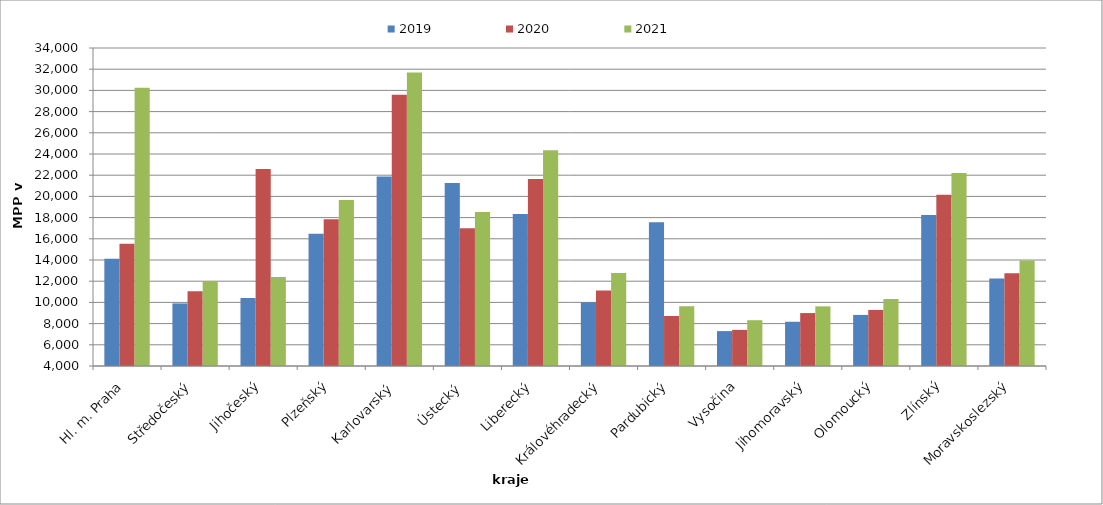
| Category | 2019 | 2020 | 2021 |
|---|---|---|---|
| Hl. m. Praha | 14118.176 | 15528.418 | 30242.815 |
| Středočeský | 9904.828 | 11043.31 | 12009.358 |
| Jihočeský | 10419.242 | 22577.951 | 12398.25 |
| Plzeňský | 16480.892 | 17841.401 | 19656.938 |
| Karlovarský  | 21866.667 | 29600 | 31680 |
| Ústecký   | 21267.487 | 17000.435 | 18530.318 |
| Liberecký | 18349.962 | 21639.233 | 24348.924 |
| Královéhradecký | 10013.961 | 11115.63 | 12762.608 |
| Pardubický | 17554.541 | 8717.297 | 9638.914 |
| Vysočina | 7292.697 | 7407.709 | 8320.759 |
| Jihomoravský | 8173.467 | 8992.786 | 9625.78 |
| Olomoucký | 8818.09 | 9292.625 | 10323.769 |
| Zlínský | 18236.08 | 20152.306 | 22212.079 |
| Moravskoslezský | 12262.59 | 12754.563 | 13945.722 |